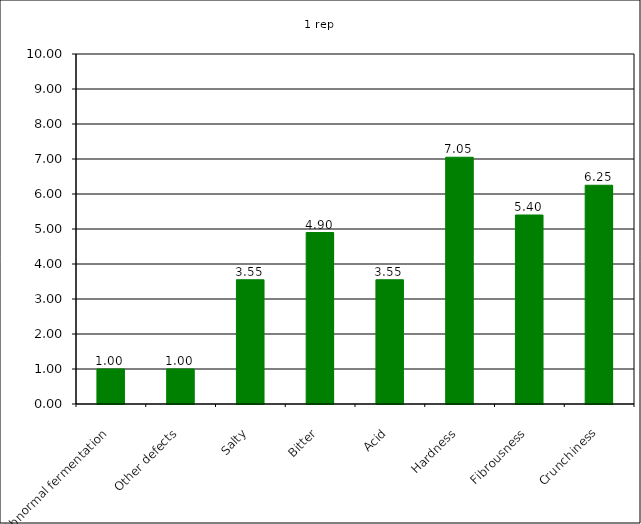
| Category | 1 rep |
|---|---|
| Abnormal fermentation | 1 |
| Other defects | 1 |
| Salty | 3.55 |
| Bitter | 4.9 |
| Acid | 3.55 |
| Hardness | 7.05 |
| Fibrousness | 5.4 |
| Crunchiness | 6.25 |